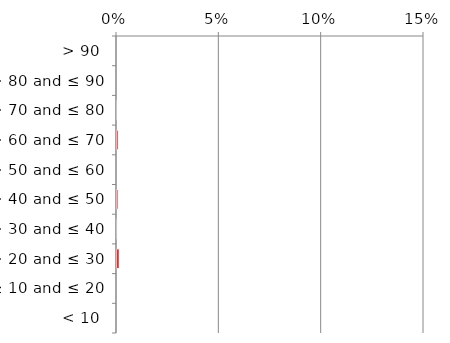
| Category | Not determinable |
|---|---|
| < 10 | 0 |
| ≥ 10 and ≤ 20 | 0 |
| > 20 and ≤ 30 | 0.001 |
| > 30 and ≤ 40 | 0 |
| > 40 and ≤ 50 | 0.001 |
| > 50 and ≤ 60 | 0 |
| > 60 and ≤ 70 | 0.001 |
| > 70 and ≤ 80 | 0 |
| > 80 and ≤ 90 | 0 |
| > 90 | 0 |